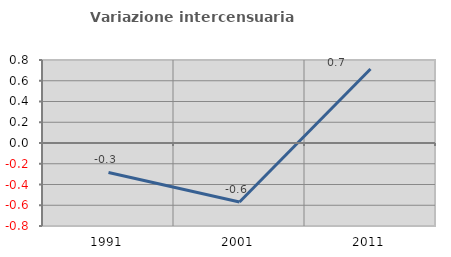
| Category | Variazione intercensuaria annua |
|---|---|
| 1991.0 | -0.284 |
| 2001.0 | -0.569 |
| 2011.0 | 0.713 |